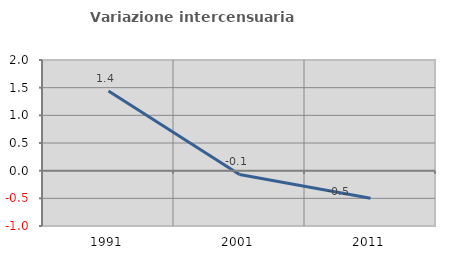
| Category | Variazione intercensuaria annua |
|---|---|
| 1991.0 | 1.438 |
| 2001.0 | -0.068 |
| 2011.0 | -0.497 |